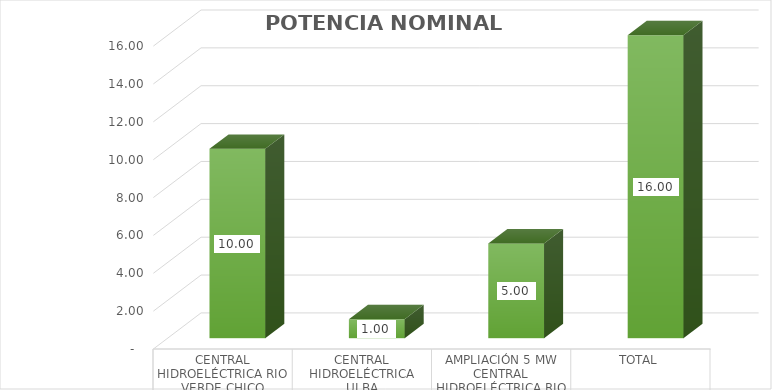
| Category | POTENCIA NOMINAL 
[MW] |
|---|---|
| CENTRAL HIDROELÉCTRICA RIO VERDE CHICO | 10 |
| CENTRAL HIDROELÉCTRICA ULBA | 1 |
| AMPLIACIÓN 5 MW CENTRAL HIDROELÉCTRICA RIO VERDE CHICO | 5 |
| TOTAL | 16 |